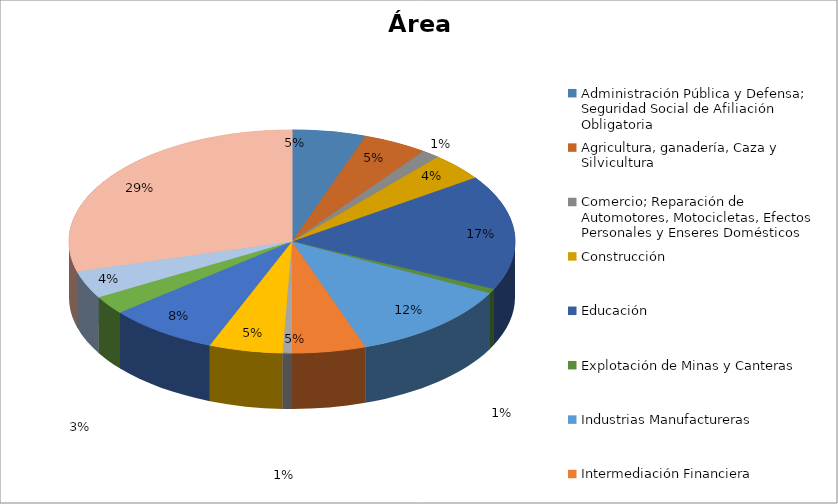
| Category | Series 0 |
|---|---|
| Administración Pública y Defensa; Seguridad Social de Afiliación Obligatoria | 0.053 |
| Agricultura, ganadería, Caza y Silvicultura | 0.047 |
| Comercio; Reparación de Automotores, Motocicletas, Efectos Personales y Enseres Domésticos | 0.013 |
| Construcción | 0.04 |
| Educación | 0.167 |
| Explotación de Minas y Canteras | 0.007 |
| Industrias Manufactureras | 0.12 |
| Intermediación Financiera | 0.053 |
| Organizaciones y Órganos Extraterritoriales | 0.007 |
| Otras Actividades de Servicios Comunitarios, Sociales y Personales | 0.053 |
| Servicios Sociales y de Salud | 0.08 |
| Suministros de Electricidad, Gas y Agua | 0.027 |
| Transporte, Almacenamiento y Comunicaciones | 0.04 |
| SIN RESPUESTA | 0.293 |